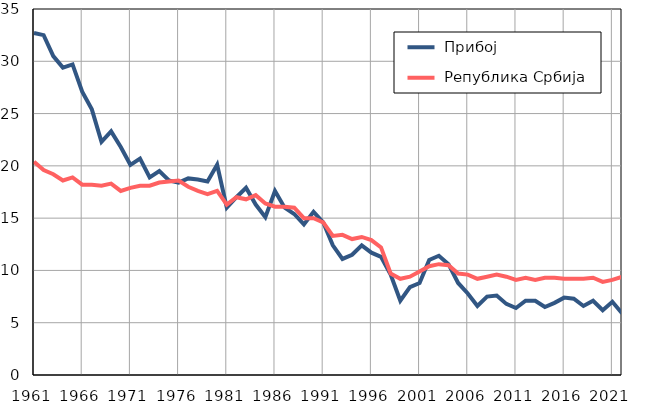
| Category |  Прибој |  Република Србија |
|---|---|---|
| 1961.0 | 32.7 | 20.4 |
| 1962.0 | 32.5 | 19.6 |
| 1963.0 | 30.5 | 19.2 |
| 1964.0 | 29.4 | 18.6 |
| 1965.0 | 29.7 | 18.9 |
| 1966.0 | 27.1 | 18.2 |
| 1967.0 | 25.4 | 18.2 |
| 1968.0 | 22.3 | 18.1 |
| 1969.0 | 23.3 | 18.3 |
| 1970.0 | 21.8 | 17.6 |
| 1971.0 | 20.1 | 17.9 |
| 1972.0 | 20.7 | 18.1 |
| 1973.0 | 18.9 | 18.1 |
| 1974.0 | 19.5 | 18.4 |
| 1975.0 | 18.6 | 18.5 |
| 1976.0 | 18.4 | 18.6 |
| 1977.0 | 18.8 | 18 |
| 1978.0 | 18.7 | 17.6 |
| 1979.0 | 18.5 | 17.3 |
| 1980.0 | 20.1 | 17.6 |
| 1981.0 | 16 | 16.3 |
| 1982.0 | 17 | 17 |
| 1983.0 | 17.9 | 16.8 |
| 1984.0 | 16.3 | 17.2 |
| 1985.0 | 15.1 | 16.4 |
| 1986.0 | 17.6 | 16.1 |
| 1987.0 | 16 | 16.1 |
| 1988.0 | 15.4 | 16 |
| 1989.0 | 14.4 | 15 |
| 1990.0 | 15.6 | 15 |
| 1991.0 | 14.6 | 14.6 |
| 1992.0 | 12.4 | 13.3 |
| 1993.0 | 11.1 | 13.4 |
| 1994.0 | 11.5 | 13 |
| 1995.0 | 12.4 | 13.2 |
| 1996.0 | 11.7 | 12.9 |
| 1997.0 | 11.3 | 12.2 |
| 1998.0 | 9.6 | 9.7 |
| 1999.0 | 7.1 | 9.2 |
| 2000.0 | 8.4 | 9.4 |
| 2001.0 | 8.8 | 9.9 |
| 2002.0 | 11 | 10.4 |
| 2003.0 | 11.4 | 10.6 |
| 2004.0 | 10.6 | 10.5 |
| 2005.0 | 8.8 | 9.7 |
| 2006.0 | 7.8 | 9.6 |
| 2007.0 | 6.6 | 9.2 |
| 2008.0 | 7.5 | 9.4 |
| 2009.0 | 7.6 | 9.6 |
| 2010.0 | 6.8 | 9.4 |
| 2011.0 | 6.4 | 9.1 |
| 2012.0 | 7.1 | 9.3 |
| 2013.0 | 7.1 | 9.1 |
| 2014.0 | 6.5 | 9.3 |
| 2015.0 | 6.9 | 9.3 |
| 2016.0 | 7.4 | 9.2 |
| 2017.0 | 7.3 | 9.2 |
| 2018.0 | 6.6 | 9.2 |
| 2019.0 | 7.1 | 9.3 |
| 2020.0 | 6.2 | 8.9 |
| 2021.0 | 7 | 9.1 |
| 2022.0 | 5.9 | 9.4 |